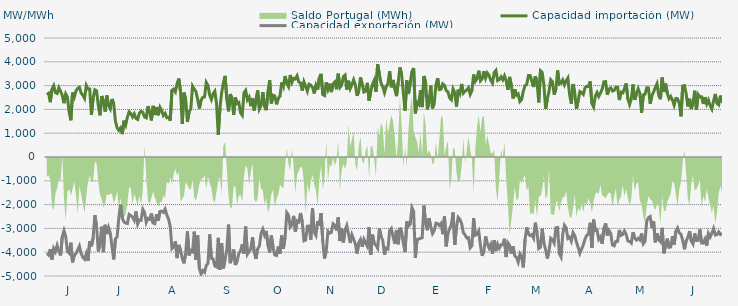
| Category | Capacidad importación (MW) | Capacidad exportación (MW) |
|---|---|---|
| 0 | 2624.958 | -4042.5 |
| 1900-01-01 | 2676.25 | -4115.625 |
| 1900-01-02 | 2302.5 | -3873.75 |
| 1900-01-03 | 2854.208 | -4308.75 |
| 1900-01-04 | 2997.833 | -3837.167 |
| 1900-01-05 | 2709.375 | -3973.125 |
| 1900-01-06 | 2670 | -3712.958 |
| 1900-01-07 | 2913.75 | -3958.125 |
| 1900-01-08 | 2765.625 | -4134.375 |
| 1900-01-09 | 2587.5 | -3352.5 |
| 1900-01-10 | 2261.25 | -3093.75 |
| 1900-01-11 | 2651.25 | -3345.208 |
| 1900-01-12 | 2510.625 | -3963.75 |
| 1900-01-13 | 1885.875 | -4044.375 |
| 1900-01-14 | 1541.5 | -3601.375 |
| 1900-01-15 | 2707.5 | -4426.875 |
| 1900-01-16 | 2516.25 | -4128.75 |
| 1900-01-17 | 2775 | -4059.375 |
| 1900-01-18 | 2883.75 | -3906.667 |
| 1900-01-19 | 2930.625 | -3742.5 |
| 1900-01-20 | 2685 | -4061.25 |
| 1900-01-21 | 2596.875 | -4213.125 |
| 1900-01-22 | 2463.75 | -4295.625 |
| 1900-01-23 | 3005.625 | -4065 |
| 1900-01-24 | 2861.25 | -4370.625 |
| 1900-01-25 | 2855.083 | -3533.583 |
| 1900-01-26 | 1775.625 | -3751.875 |
| 1900-01-27 | 2478.75 | -3391.875 |
| 1900-01-28 | 2821.875 | -2444.375 |
| 1900-01-29 | 2782.5 | -2903.75 |
| 1900-01-30 | 2169.375 | -3964.667 |
| 1900-01-31 | 1751.292 | -3614.625 |
| 1900-02-01 | 2561.25 | -2926.875 |
| 1900-02-02 | 2356.875 | -3995.625 |
| 1900-02-03 | 1911.125 | -2849.625 |
| 1900-02-04 | 2583.75 | -3240 |
| 1900-02-05 | 2157.125 | -2962.917 |
| 1900-02-06 | 2021.375 | -3195.625 |
| 1900-02-07 | 2439.375 | -3776.25 |
| 1900-02-08 | 2235 | -4305 |
| 1900-02-09 | 1509.375 | -3436.875 |
| 1900-02-10 | 1230.208 | -3360 |
| 1900-02-11 | 1123.125 | -2546.875 |
| 1900-02-12 | 1221.25 | -1995.875 |
| 1900-02-13 | 962.083 | -2563.125 |
| 1900-02-14 | 1523.958 | -2728.125 |
| 1900-02-15 | 1344.375 | -2776.875 |
| 1900-02-16 | 1676.25 | -2795.625 |
| 1900-02-17 | 1899.375 | -2411.25 |
| 1900-02-18 | 1826.25 | -2461.875 |
| 1900-02-19 | 1680 | -2529.375 |
| 1900-02-20 | 1815 | -2662.5 |
| 1900-02-21 | 1621.458 | -2287.5 |
| 1900-02-22 | 1577.083 | -2818.125 |
| 1900-02-23 | 1846.875 | -2643.75 |
| 1900-02-24 | 1923.75 | -2656.875 |
| 1900-02-25 | 1875 | -2195.625 |
| 1900-02-26 | 1683.75 | -2330.625 |
| 1900-02-27 | 1646.25 | -2746.875 |
| 1900-02-28 | 2137.5 | -2580.5 |
| 1900-02-28 | 1860 | -2620.625 |
| 1900-03-01 | 1537.5 | -2371.875 |
| 1900-03-02 | 2149.292 | -2771.25 |
| 1900-03-03 | 1766.25 | -2801.25 |
| 1900-03-04 | 2097.75 | -2405.625 |
| 1900-03-05 | 1753.125 | -2676.75 |
| 1900-03-06 | 2090.625 | -2285.292 |
| 1900-03-07 | 1956.125 | -2274.75 |
| 1900-03-08 | 1743.75 | -2330.125 |
| 1900-03-09 | 1833.75 | -2185.875 |
| 1900-03-10 | 1651.875 | -2439.375 |
| 1900-03-11 | 1677 | -2608.125 |
| 1900-03-12 | 1526.25 | -2926.875 |
| 1900-03-13 | 2806.875 | -3847.5 |
| 1900-03-14 | 2853.75 | -3770.625 |
| 1900-03-15 | 2739.375 | -3542.5 |
| 1900-03-16 | 3086.25 | -4248.75 |
| 1900-03-17 | 3294.375 | -3694.583 |
| 1900-03-18 | 2737.5 | -3914.167 |
| 1900-03-19 | 1388.958 | -4258.125 |
| 1900-03-20 | 2705.625 | -4468.125 |
| 1900-03-21 | 2414.25 | -4032.292 |
| 1900-03-22 | 1474.5 | -3127.5 |
| 1900-03-23 | 1904.833 | -4134.375 |
| 1900-03-24 | 2018.333 | -3933.75 |
| 1900-03-25 | 2978.625 | -3980.625 |
| 1900-03-26 | 2851.875 | -3137.917 |
| 1900-03-27 | 2745 | -4327.5 |
| 1900-03-28 | 2411.25 | -3294.375 |
| 1900-03-29 | 2032.5 | -4693.125 |
| 1900-03-30 | 2394.375 | -4916.25 |
| 1900-03-31 | 2506.875 | -4770 |
| 1900-04-01 | 2527.5 | -4845 |
| 1900-04-02 | 3132.875 | -4556.25 |
| 1900-04-03 | 3001.875 | -4479.375 |
| 1900-04-04 | 2597 | -3253.75 |
| 1900-04-05 | 2415.833 | -4258.125 |
| 1900-04-06 | 2655 | -4284.375 |
| 1900-04-07 | 2764.458 | -4576.875 |
| 1900-04-08 | 2248.625 | -4616.25 |
| 1900-04-09 | 931.875 | -3396.042 |
| 1900-04-10 | 2074.792 | -4740 |
| 1900-04-11 | 2707.5 | -3624.375 |
| 1900-04-12 | 3118.125 | -4681.875 |
| 1900-04-13 | 3408.75 | -4280.625 |
| 1900-04-14 | 2415 | -3889.583 |
| 1900-04-15 | 1918.917 | -2840.25 |
| 1900-04-16 | 2645.125 | -4460.625 |
| 1900-04-17 | 2469.792 | -4186.875 |
| 1900-04-18 | 1772.542 | -3887.917 |
| 1900-04-19 | 2498.667 | -4538.125 |
| 1900-04-20 | 2245.542 | -4370 |
| 1900-04-21 | 2285.625 | -4056.25 |
| 1900-04-22 | 1862.708 | -3941.667 |
| 1900-04-23 | 1755.417 | -3663.125 |
| 1900-04-24 | 2699.583 | -4063.125 |
| 1900-04-25 | 2797.5 | -2925.625 |
| 1900-04-26 | 2403.333 | -4085.625 |
| 1900-04-27 | 2516.25 | -3971.25 |
| 1900-04-28 | 2135.625 | -3854.792 |
| 1900-04-29 | 2477.125 | -3369.292 |
| 1900-04-30 | 1956.292 | -3999.375 |
| 1900-05-01 | 2427.5 | -4280 |
| 1900-05-02 | 2798 | -3856.875 |
| 1900-05-03 | 2018.125 | -3744.583 |
| 1900-05-04 | 2168.958 | -3208.75 |
| 1900-05-05 | 2728.125 | -3034.375 |
| 1900-05-06 | 2131.75 | -3278.125 |
| 1900-05-07 | 1966.875 | -3106.458 |
| 1900-05-08 | 2738.083 | -3703.375 |
| 1900-05-09 | 3229.167 | -4012.5 |
| 1900-05-10 | 2249.792 | -3300.833 |
| 1900-05-11 | 2592.917 | -3809.792 |
| 1900-05-12 | 2566.25 | -4116.667 |
| 1900-05-13 | 2212.5 | -4138.708 |
| 1900-05-14 | 2464.375 | -3755.833 |
| 1900-05-15 | 2551.042 | -4061.25 |
| 1900-05-16 | 3133.5 | -3295.833 |
| 1900-05-17 | 2953.75 | -3854.167 |
| 1900-05-18 | 3401.25 | -3375.917 |
| 1900-05-19 | 3082.5 | -2336.25 |
| 1900-05-20 | 2949.375 | -2439.375 |
| 1900-05-21 | 3446.25 | -2947.5 |
| 1900-05-22 | 3138.75 | -2840.625 |
| 1900-05-23 | 3305 | -2472.958 |
| 1900-05-24 | 3276.125 | -3134.625 |
| 1900-05-25 | 3410.625 | -2685.417 |
| 1900-05-26 | 3153.75 | -2727.292 |
| 1900-05-27 | 3110.625 | -2351.25 |
| 1900-05-28 | 2786.458 | -2737.5 |
| 1900-05-29 | 3159.375 | -3519.375 |
| 1900-05-30 | 2974.6 | -3488.4 |
| 1900-05-31 | 2766.667 | -2906.917 |
| 1900-06-01 | 3058.125 | -2902.5 |
| 1900-06-02 | 3018.75 | -3474.375 |
| 1900-06-03 | 2925.625 | -2158.375 |
| 1900-06-04 | 2670.667 | -3157.5 |
| 1900-06-05 | 3015 | -3296.25 |
| 1900-06-06 | 2835.25 | -2693.125 |
| 1900-06-07 | 3337.5 | -2882.083 |
| 1900-06-08 | 3493.125 | -2358.75 |
| 1900-06-09 | 2626.042 | -3555 |
| 1900-06-10 | 2583.542 | -4267.5 |
| 1900-06-11 | 3140.625 | -3948.75 |
| 1900-06-12 | 2844.375 | -3122.5 |
| 1900-06-13 | 3082.5 | -3200.625 |
| 1900-06-14 | 2726.25 | -3170.625 |
| 1900-06-15 | 3071.25 | -2806.875 |
| 1900-06-16 | 3151.875 | -2865 |
| 1900-06-17 | 2845.417 | -3084.375 |
| 1900-06-18 | 3500.625 | -2536.875 |
| 1900-06-19 | 2921.75 | -3531.625 |
| 1900-06-20 | 3012.625 | -2985.75 |
| 1900-06-21 | 3378.75 | -3590.625 |
| 1900-06-22 | 3442.5 | -3078.75 |
| 1900-06-23 | 2829.167 | -2881.042 |
| 1900-06-24 | 3205.833 | -3234.375 |
| 1900-06-25 | 2873.625 | -3613.125 |
| 1900-06-26 | 3038.333 | -3270 |
| 1900-06-27 | 3245.625 | -3459.375 |
| 1900-06-28 | 3029.167 | -3656.25 |
| 1900-06-29 | 2571.042 | -4057.5 |
| 1900-06-30 | 2766.125 | -3596.417 |
| 1900-07-01 | 3348.75 | -3465 |
| 1900-07-02 | 3046.333 | -3774.375 |
| 1900-07-03 | 2732.708 | -3460.042 |
| 1900-07-04 | 2770.75 | -3616.875 |
| 1900-07-05 | 3116.25 | -3757.75 |
| 1900-07-06 | 2370.5 | -2949.375 |
| 1900-07-07 | 2758.625 | -4102.5 |
| 1900-07-08 | 3054.167 | -3262.5 |
| 1900-07-09 | 3221.875 | -3637.5 |
| 1900-07-10 | 2734.792 | -3695.625 |
| 1900-07-11 | 3901.875 | -3830.625 |
| 1900-07-12 | 3478.125 | -3007.5 |
| 1900-07-13 | 3100.208 | -3343.125 |
| 1900-07-14 | 2951.458 | -3500.625 |
| 1900-07-15 | 2703.125 | -4100.625 |
| 1900-07-16 | 2949.667 | -3832.5 |
| 1900-07-17 | 3092.292 | -3864.375 |
| 1900-07-18 | 3609.375 | -3088.125 |
| 1900-07-19 | 2928.75 | -3003.75 |
| 1900-07-20 | 3238.333 | -3346.875 |
| 1900-07-21 | 2865.417 | -3639.375 |
| 1900-07-22 | 2557.917 | -3067.5 |
| 1900-07-23 | 3131.667 | -3665.625 |
| 1900-07-24 | 3761.25 | -2973.625 |
| 1900-07-25 | 3468.542 | -3153.75 |
| 1900-07-26 | 2673.75 | -3622.5 |
| 1900-07-27 | 1945.625 | -3999.375 |
| 1900-07-28 | 3222.083 | -2703.875 |
| 1900-07-29 | 2645.458 | -2900.625 |
| 1900-07-30 | 3097.5 | -2827.5 |
| 1900-07-31 | 3595.208 | -2128.75 |
| 1900-08-01 | 3741.458 | -2283.75 |
| 1900-08-02 | 1833.125 | -4242.5 |
| 1900-08-03 | 2294.25 | -3457.125 |
| 1900-08-04 | 2210.833 | -3444.375 |
| 1900-08-05 | 2808.75 | -3420 |
| 1900-08-06 | 2098.083 | -3391.875 |
| 1900-08-07 | 3404.792 | -2041.875 |
| 1900-08-08 | 3136.875 | -2790.292 |
| 1900-08-09 | 2001.25 | -3075.75 |
| 1900-08-10 | 2334.583 | -2570.625 |
| 1900-08-11 | 2998.542 | -2932.5 |
| 1900-08-12 | 2041.583 | -3219.375 |
| 1900-08-13 | 2261.875 | -3091.875 |
| 1900-08-14 | 3017.292 | -2780.625 |
| 1900-08-15 | 3316.667 | -2796 |
| 1900-08-16 | 2831.875 | -2880.375 |
| 1900-08-17 | 2848.875 | -2791.375 |
| 1900-08-18 | 3072.083 | -3242.5 |
| 1900-08-19 | 3008.75 | -2494.125 |
| 1900-08-20 | 2789.75 | -3753.75 |
| 1900-08-21 | 2740.75 | -3208.125 |
| 1900-08-22 | 2484.167 | -3015 |
| 1900-08-23 | 2405.083 | -2845.208 |
| 1900-08-24 | 2862.542 | -2330.625 |
| 1900-08-25 | 2704.875 | -3693.75 |
| 1900-08-26 | 2121.458 | -2932.25 |
| 1900-08-27 | 2826.875 | -2536.458 |
| 1900-08-28 | 2666.25 | -2617.875 |
| 1900-08-29 | 3068.375 | -2797.625 |
| 1900-08-30 | 2681.458 | -3181.875 |
| 1900-08-31 | 2762.167 | -3268.125 |
| 1900-09-01 | 2816.458 | -3403.125 |
| 1900-09-02 | 2908.75 | -3388.125 |
| 1900-09-03 | 2628.458 | -3817.5 |
| 1900-09-04 | 2784.5 | -3729.375 |
| 1900-09-05 | 3466.875 | -2575.375 |
| 1900-09-06 | 3180 | -3284.375 |
| 1900-09-07 | 3301.25 | -3251.25 |
| 1900-09-08 | 3624.375 | -3114.375 |
| 1900-09-09 | 3203.333 | -3733.125 |
| 1900-09-10 | 3288.125 | -4155 |
| 1900-09-11 | 3606.25 | -3943.125 |
| 1900-09-12 | 3313.75 | -3335.625 |
| 1900-09-13 | 3531.417 | -3646.875 |
| 1900-09-14 | 3433.125 | -3826.875 |
| 1900-09-15 | 3223.542 | -3673.333 |
| 1900-09-16 | 3103.75 | -4066.875 |
| 1900-09-17 | 3546.25 | -3496.875 |
| 1900-09-18 | 3638.5 | -3952.5 |
| 1900-09-19 | 3210 | -3661.875 |
| 1900-09-20 | 3255.417 | -3826.875 |
| 1900-09-21 | 3367.5 | -3690 |
| 1900-09-22 | 3244.5 | -3684.375 |
| 1900-09-23 | 3411.458 | -3435 |
| 1900-09-24 | 3192.708 | -4203.75 |
| 1900-09-25 | 2825 | -3605.625 |
| 1900-09-26 | 3365.667 | -3718.625 |
| 1900-09-27 | 3014.375 | -4063.125 |
| 1900-09-28 | 2458.292 | -3762 |
| 1900-09-29 | 2845.5 | -4151.25 |
| 1900-09-30 | 2597.292 | -4215 |
| 1900-10-01 | 2650.375 | -4415.625 |
| 1900-10-02 | 2331.042 | -4066.875 |
| 1900-10-03 | 2415.625 | -4185 |
| 1900-10-04 | 2763.875 | -4638.75 |
| 1900-10-05 | 2996.042 | -3465 |
| 1900-10-06 | 3054.375 | -2960.625 |
| 1900-10-07 | 3421.875 | -3238.875 |
| 1900-10-08 | 3422.25 | -3301.458 |
| 1900-10-09 | 3168.75 | -3257.708 |
| 1900-10-10 | 2940.75 | -3407.5 |
| 1900-10-11 | 3391.875 | -2758.75 |
| 1900-10-12 | 3159.375 | -3175.208 |
| 1900-10-13 | 2294.792 | -3843.75 |
| 1900-10-14 | 3620.625 | -3793.125 |
| 1900-10-15 | 3550.208 | -3016.875 |
| 1900-10-16 | 3036.458 | -3616.875 |
| 1900-10-17 | 2023.333 | -3886.25 |
| 1900-10-18 | 2440.208 | -4263.75 |
| 1900-10-19 | 2764.167 | -3943.125 |
| 1900-10-20 | 3245.625 | -3410.667 |
| 1900-10-21 | 3161.25 | -3470.625 |
| 1900-10-22 | 2621.458 | -3614.625 |
| 1900-10-23 | 2861.25 | -2975.958 |
| 1900-10-24 | 3635.217 | -2962.391 |
| 1900-10-25 | 3071.083 | -4052.75 |
| 1900-10-26 | 3103.625 | -4196.25 |
| 1900-10-27 | 3238.125 | -3235.75 |
| 1900-10-28 | 3031.875 | -2868.708 |
| 1900-10-29 | 3202.5 | -2981.292 |
| 1900-10-30 | 3320.625 | -3422.292 |
| 1900-10-31 | 2615.625 | -3370.417 |
| 1900-11-01 | 2244.375 | -3535.625 |
| 1900-11-02 | 3067.5 | -3176.25 |
| 1900-11-03 | 2692.458 | -3306.875 |
| 1900-11-04 | 2025 | -3576.042 |
| 1900-11-05 | 2373.833 | -3795 |
| 1900-11-06 | 2750.458 | -4045 |
| 1900-11-07 | 2704.167 | -3868.417 |
| 1900-11-08 | 2628.75 | -3691.667 |
| 1900-11-09 | 2910 | -3448.125 |
| 1900-11-10 | 2971.875 | -3293.375 |
| 1900-11-11 | 2958.5 | -3229.167 |
| 1900-11-12 | 3174.375 | -2764.583 |
| 1900-11-13 | 2253.75 | -3813.75 |
| 1900-11-14 | 2100 | -2628.667 |
| 1900-11-15 | 2557.5 | -3088.333 |
| 1900-11-16 | 2713.125 | -3062.25 |
| 1900-11-17 | 2546.875 | -3463.625 |
| 1900-11-18 | 2686.458 | -3359.458 |
| 1900-11-19 | 2850 | -3646.042 |
| 1900-11-20 | 3159.375 | -2992.292 |
| 1900-11-21 | 3166.875 | -2793.125 |
| 1900-11-22 | 2613.75 | -3298.833 |
| 1900-11-23 | 2857.5 | -3089.625 |
| 1900-11-24 | 2903.875 | -3210.125 |
| 1900-11-25 | 2772 | -3696.792 |
| 1900-11-26 | 2797.5 | -3731.25 |
| 1900-11-27 | 2930.625 | -3545.625 |
| 1900-11-28 | 2932.5 | -3541.875 |
| 1900-11-29 | 2390.625 | -3064.167 |
| 1900-11-30 | 2726.25 | -3293.333 |
| 1900-12-01 | 2694.375 | -3252.708 |
| 1900-12-02 | 2878.125 | -3111.875 |
| 1900-12-03 | 3088.125 | -3247.5 |
| 1900-12-04 | 2435.625 | -3528.958 |
| 1900-12-05 | 2206.875 | -3547.708 |
| 1900-12-06 | 2435.625 | -3618.75 |
| 1900-12-07 | 3046.875 | -3157.917 |
| 1900-12-08 | 2400 | -3406.875 |
| 1900-12-09 | 2640 | -3488.125 |
| 1900-12-10 | 2866.875 | -3413.542 |
| 1900-12-11 | 2675.625 | -3486.458 |
| 1900-12-12 | 1861.25 | -3211.667 |
| 1900-12-13 | 2611.875 | -3644.375 |
| 1900-12-14 | 2638.125 | -3547.083 |
| 1900-12-15 | 2906.25 | -2688.333 |
| 1900-12-16 | 2904.375 | -2549.583 |
| 1900-12-17 | 2240.625 | -2502.083 |
| 1900-12-18 | 2576.25 | -2981.667 |
| 1900-12-19 | 2732.25 | -2689.375 |
| 1900-12-20 | 2919.375 | -3586.875 |
| 1900-12-21 | 3078.75 | -3206.25 |
| 1900-12-22 | 2587.5 | -3481.875 |
| 1900-12-23 | 2430 | -3560.625 |
| 1900-12-24 | 3341.25 | -2977.542 |
| 1900-12-25 | 2733.75 | -4046.25 |
| 1900-12-26 | 3080.625 | -3725.417 |
| 1900-12-27 | 2681.25 | -3429.375 |
| 1900-12-28 | 2448.75 | -3793.125 |
| 1900-12-29 | 2544.125 | -3778.125 |
| 1900-12-30 | 2394.958 | -3328.125 |
| 1900-12-31 | 2175 | -3678.75 |
| 1901-01-01 | 2461.167 | -3117.375 |
| 1901-01-02 | 2448.75 | -2981.542 |
| 1901-01-03 | 2255.042 | -3185.833 |
| 1901-01-04 | 1708.042 | -3250.208 |
| 1901-01-05 | 2981.25 | -3508.125 |
| 1901-01-06 | 2998.125 | -3877.5 |
| 1901-01-07 | 2664.375 | -3519.375 |
| 1901-01-08 | 2124.375 | -3382.5 |
| 1901-01-09 | 2446.875 | -3115.792 |
| 1901-01-10 | 2015.417 | -3534.375 |
| 1901-01-11 | 2289.375 | -3658.125 |
| 1901-01-12 | 2784.375 | -3211.083 |
| 1901-01-13 | 1993.125 | -3504.792 |
| 1901-01-14 | 2624.875 | -3506.458 |
| 1901-01-15 | 2523.75 | -3042.583 |
| 1901-01-16 | 2531.25 | -3613.125 |
| 1901-01-17 | 2229.583 | -3620.625 |
| 1901-01-18 | 2515.875 | -3455.625 |
| 1901-01-19 | 2227.5 | -3723.75 |
| 1901-01-20 | 2388.375 | -3217.458 |
| 1901-01-21 | 2157.875 | -3361.542 |
| 1901-01-22 | 2014.583 | -3202.708 |
| 1901-01-23 | 2357.917 | -3006.583 |
| 1901-01-24 | 2647.75 | -3275.625 |
| 1901-01-25 | 2259.375 | -3258.75 |
| 1901-01-26 | 2191.875 | -3148.125 |
| 1901-01-27 | 2578.125 | -3256.875 |
| 1901-01-28 | 2289.375 | -3211.875 |